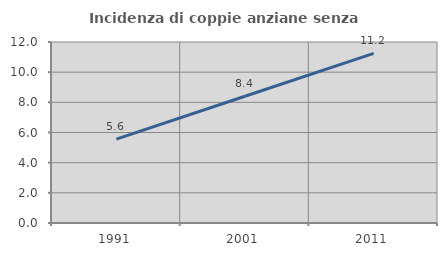
| Category | Incidenza di coppie anziane senza figli  |
|---|---|
| 1991.0 | 5.561 |
| 2001.0 | 8.401 |
| 2011.0 | 11.244 |